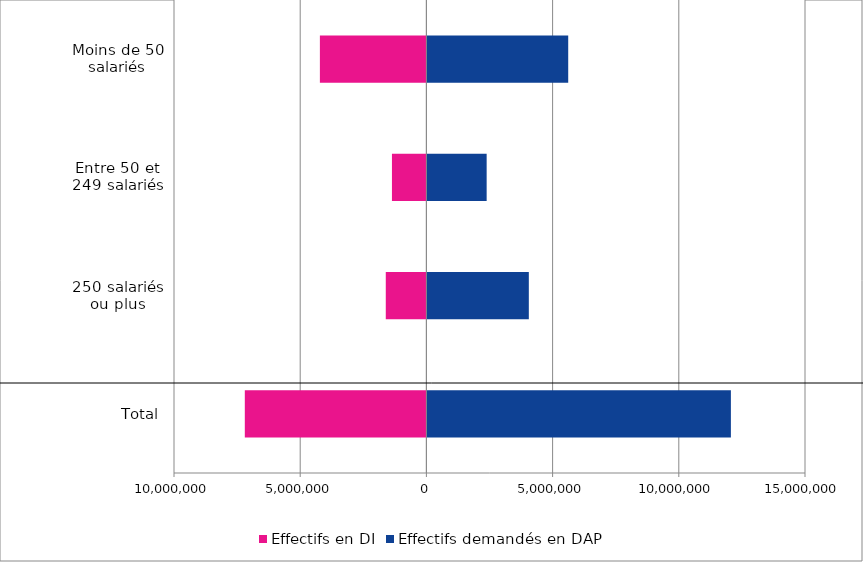
| Category | Effectifs en DI | Effectifs demandés en DAP |
|---|---|---|
| Total | -7194462 | 12063916 |
| 250 salariés ou plus | -1609435 | 4058024 |
| Entre 50 et 249 salariés | -1365056 | 2387302 |
| Moins de 50 salariés | -4219971 | 5618590 |